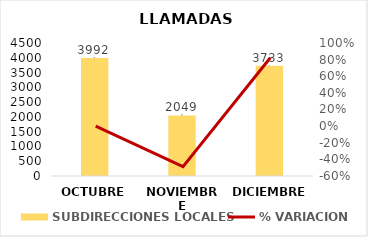
| Category | SUBDIRECCIONES LOCALES |
|---|---|
| OCTUBRE | 3992 |
| NOVIEMBRE | 2049 |
| DICIEMBRE | 3733 |